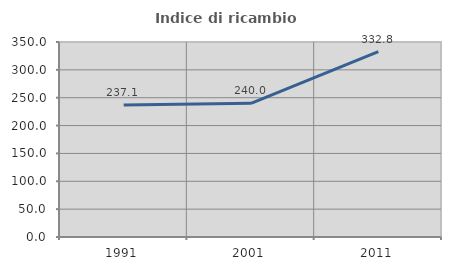
| Category | Indice di ricambio occupazionale  |
|---|---|
| 1991.0 | 237.143 |
| 2001.0 | 240 |
| 2011.0 | 332.759 |